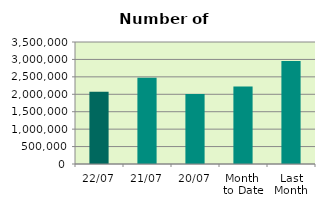
| Category | Series 0 |
|---|---|
| 22/07 | 2075750 |
| 21/07 | 2473498 |
| 20/07 | 2009224 |
| Month 
to Date | 2224623.5 |
| Last
Month | 2956123.091 |